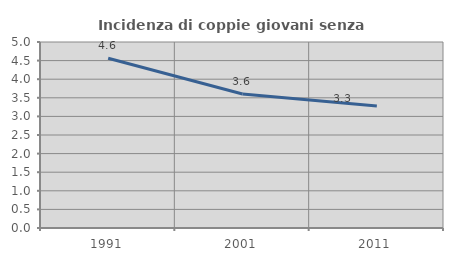
| Category | Incidenza di coppie giovani senza figli |
|---|---|
| 1991.0 | 4.562 |
| 2001.0 | 3.604 |
| 2011.0 | 3.281 |